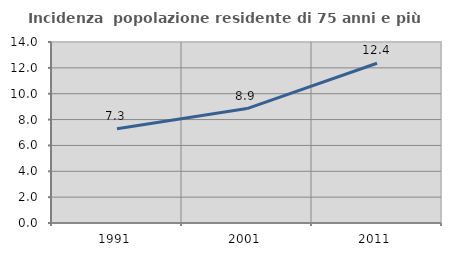
| Category | Incidenza  popolazione residente di 75 anni e più |
|---|---|
| 1991.0 | 7.284 |
| 2001.0 | 8.852 |
| 2011.0 | 12.355 |